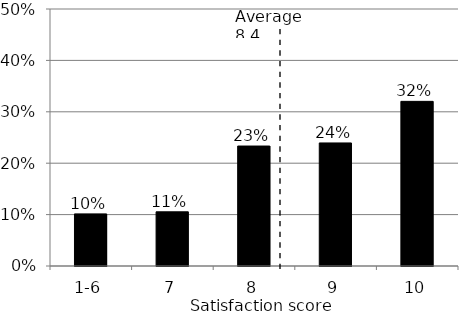
| Category | Series 1 |
|---|---|
| 1-6 | 0.101 |
| 7 | 0.105 |
| 8 | 0.233 |
| 9 | 0.239 |
| 10 | 0.32 |